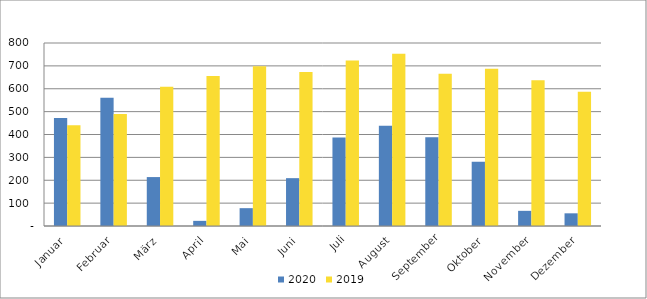
| Category | 2020 | 2019 |
|---|---|---|
| Januar | 472173 | 440899 |
| Februar | 560787 | 489237 |
| März | 213906 | 608832 |
| April | 22459 | 655723 |
| Mai | 77962 | 698660 |
| Juni | 209142 | 672693 |
| Juli | 386989 | 723514 |
| August | 438253 | 753434 |
| September | 387576 | 665588 |
| Oktober | 281113 | 687064 |
| November | 66272 | 637073 |
| Dezember | 55430 | 586516 |